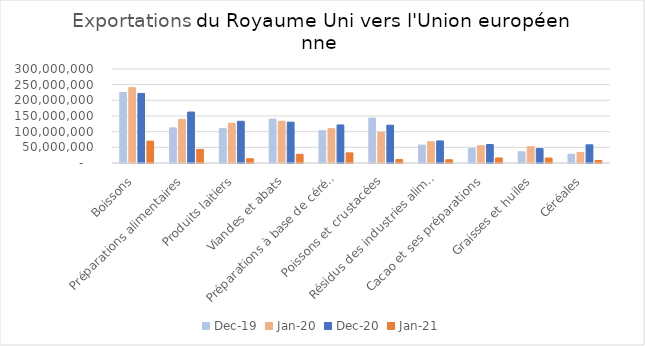
| Category | déc-19 | janv-20 | déc-20 | janv-21 |
|---|---|---|---|---|
| Boissons | 224922278 | 240536817 | 222005243 | 69796960 |
| Préparations alimentaires | 112014296 | 139388366 | 162677473 | 43467819 |
| Produits laitiers | 109806601 | 127030452 | 133101317 | 13699906 |
| Viandes et abats | 140066080 | 133233606 | 130346813 | 27705700 |
| Préparations à base de céréales | 103124497 | 109608966 | 121467659 | 32377433 |
| Poissons et crustacées | 143430171 | 98172014 | 120662556 | 11045696 |
| Résidus des industries alimentaires | 57186728 | 67830745 | 70394099 | 10332001 |
| Cacao et ses préparations | 46280270 | 55174115 | 59038821 | 16073678 |
| Graisses et huiles | 35874896 | 51979402 | 45956948 | 15894286 |
| Céréales | 27924065 | 33763915 | 58049001 | 8144839 |